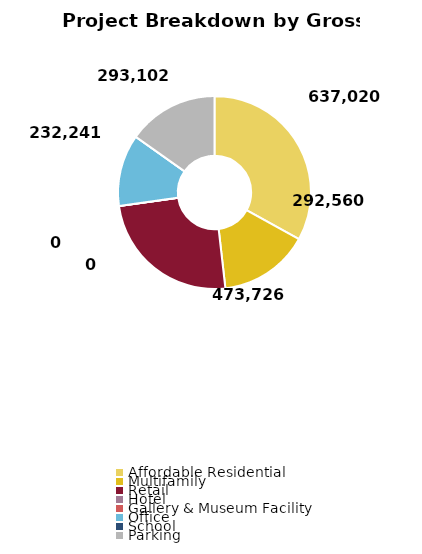
| Category | Series 0 |
|---|---|
| Affordable Residential | 637020 |
| Multifamily | 292560.002 |
| Retail | 473726.4 |
| Hotel | 0.005 |
| Gallery & Museum Facility | 0 |
| Office | 232240.8 |
| School | 0 |
| Parking | 293102.4 |